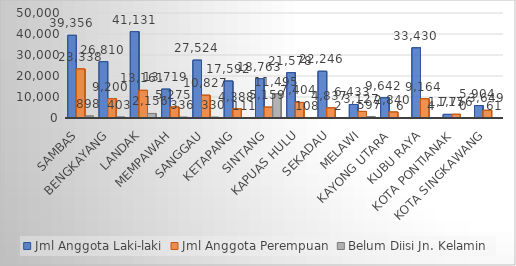
| Category | Jml Anggota Laki-laki | Jml Anggota Perempuan | Belum Diisi Jn. Kelamin |
|---|---|---|---|
| Sambas | 39356 | 23338 | 898 |
| Bengkayang | 26810 | 9200 | 403 |
| Landak | 41131 | 13161 | 2156 |
| Mempawah | 13719 | 5275 | 336 |
| Sanggau | 27524 | 10827 | 330 |
| Ketapang | 17592 | 4388 | 111 |
| Sintang | 18763 | 5159 | 11495 |
| Kapuas Hulu | 21578 | 7404 | 108 |
| Sekadau | 22246 | 4837 | 2 |
| Melawi | 6433 | 3127 | 597 |
| Kayong Utara | 9642 | 2840 | 6 |
| Kubu Raya | 33430 | 9164 | 4 |
| Kota Pontianak | 1717 | 1756 | 0 |
| Kota Singkawang | 5904 | 3649 | 61 |